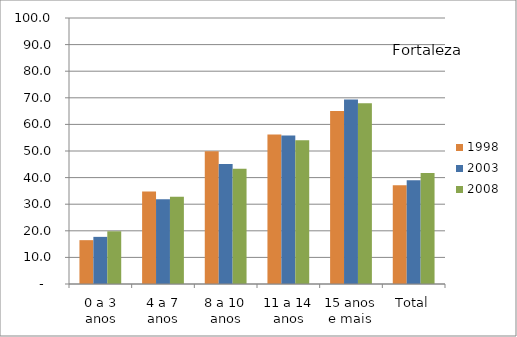
| Category | 1998 | 2003 | 2008 |
|---|---|---|---|
| 0 a 3 anos | 16.48 | 17.72 | 19.82 |
| 4 a 7 anos | 34.8 | 31.89 | 32.76 |
| 8 a 10 anos | 49.88 | 45.07 | 43.32 |
| 11 a 14 anos | 56.16 | 55.84 | 54.03 |
| 15 anos e mais | 65.05 | 69.36 | 67.93 |
| Total | 37.11 | 38.97 | 41.76 |